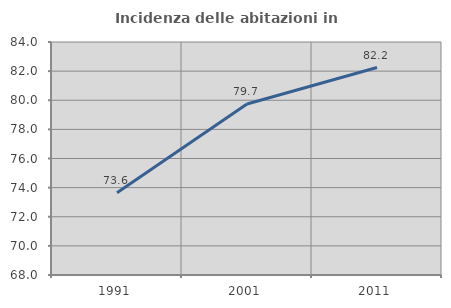
| Category | Incidenza delle abitazioni in proprietà  |
|---|---|
| 1991.0 | 73.643 |
| 2001.0 | 79.746 |
| 2011.0 | 82.246 |